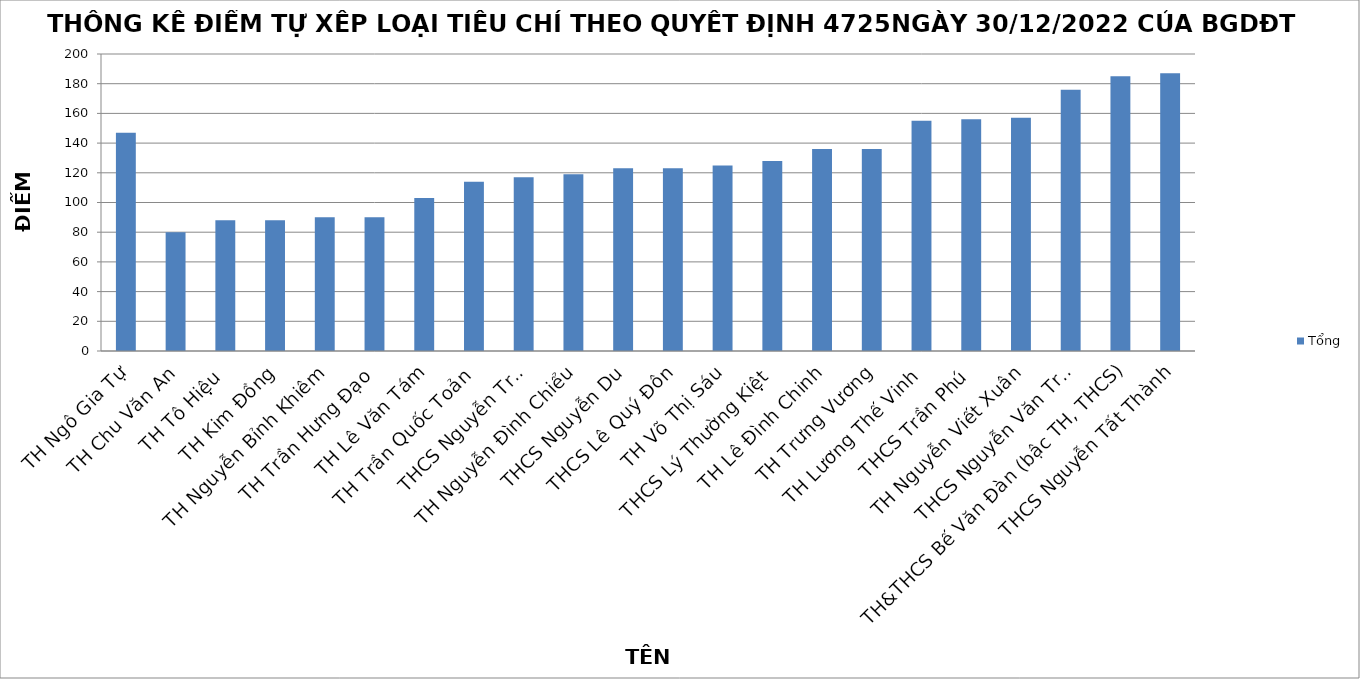
| Category | Tổng |
|---|---|
| TH Ngô Gia Tự | 147 |
| TH Chu Văn An | 80 |
| TH Tô Hiệu | 88 |
| TH Kim Đồng | 88 |
| TH Nguyễn Bỉnh Khiêm | 90 |
| TH Trần Hưng Đạo | 90 |
| TH Lê Văn Tám | 103 |
| TH Trần Quốc Toản | 114 |
| THCS Nguyễn Trãi | 117 |
| TH Nguyễn Đình Chiểu | 119 |
| THCS Nguyễn Du | 123 |
| THCS Lê Quý Đôn | 123 |
| TH Võ Thị Sáu | 125 |
| THCS Lý Thường Kiệt | 128 |
| TH Lê Đình Chinh | 136 |
| TH Trưng Vương | 136 |
| TH Lương Thế Vinh | 155 |
| THCS Trần Phú | 156 |
| TH Nguyễn Viết Xuân | 157 |
| THCS Nguyễn Văn Trỗi | 176 |
| TH&THCS Bế Văn Đàn (bậc TH, THCS) | 185 |
| THCS Nguyễn Tất Thành | 187 |